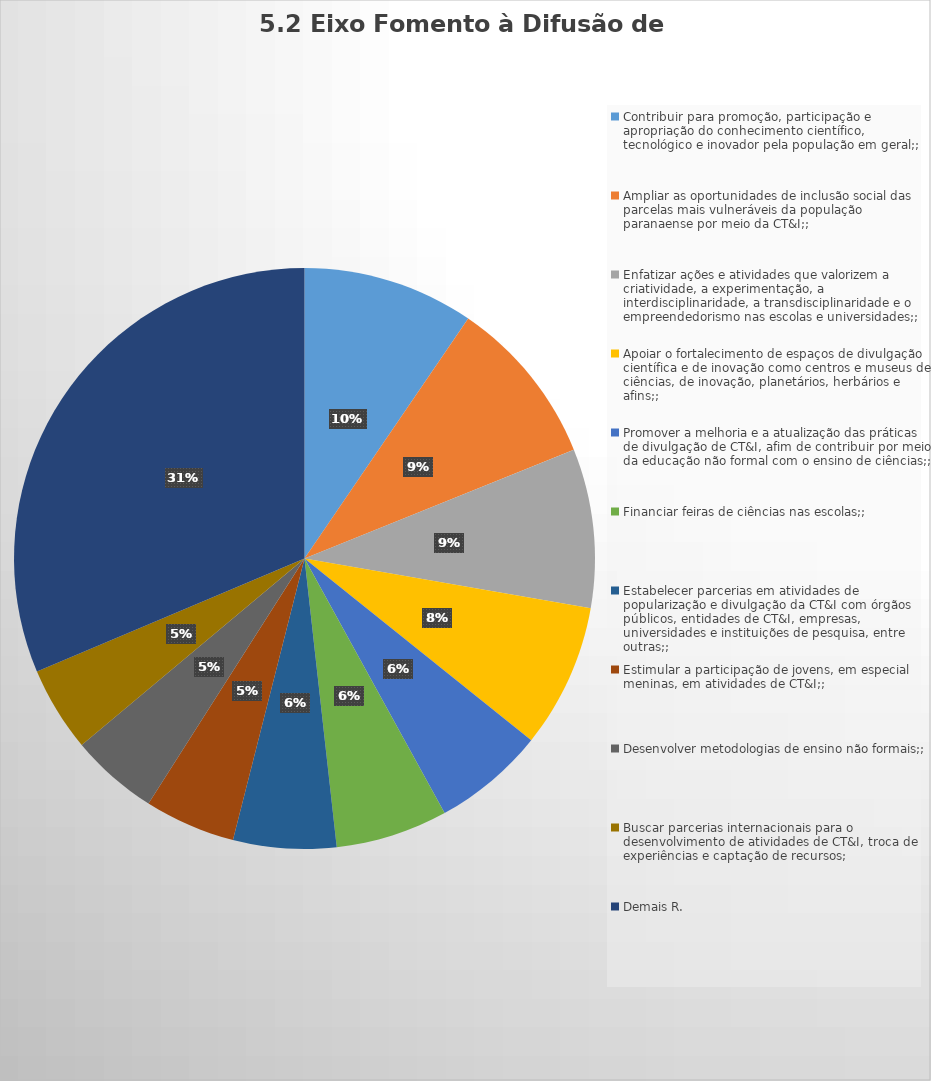
| Category | Series 0 |
|---|---|
| Contribuir para promoção, participação e apropriação do conhecimento científico, tecnológico e inovador pela população em geral;; | 113 |
| Ampliar as oportunidades de inclusão social das parcelas mais vulneráveis da população paranaense por meio da CT&I;; | 111 |
| Enfatizar ações e atividades que valorizem a criatividade, a experimentação, a interdisciplinaridade, a transdisciplinaridade e o empreendedorismo nas escolas e universidades;; | 105 |
| Apoiar o fortalecimento de espaços de divulgação científica e de inovação como centros e museus de ciências, de inovação, planetários, herbários e afins;; | 95 |
| Promover a melhoria e a atualização das práticas de divulgação de CT&I, afim de contribuir por meio da educação não formal com o ensino de ciências;; | 74 |
| Financiar feiras de ciências nas escolas;; | 74 |
| Estabelecer parcerias em atividades de popularização e divulgação da CT&I com órgãos públicos, entidades de CT&I, empresas, universidades e instituições de pesquisa, entre outras;; | 68 |
| Estimular a participação de jovens, em especial meninas, em atividades de CT&I;; | 60 |
| Desenvolver metodologias de ensino não formais;; | 58 |
| Buscar parcerias internacionais para o desenvolvimento de atividades de CT&I, troca de experiências e captação de recursos; | 56 |
| Demais R. | 372 |